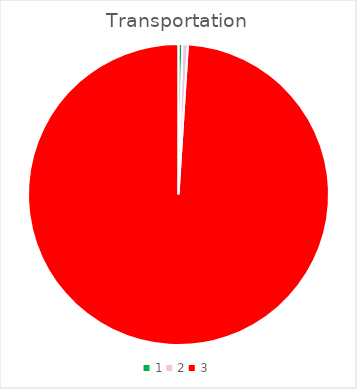
| Category | Series 0 |
|---|---|
| 0 | 0.032 |
| 1 | 0.047 |
| 2 | 7.801 |